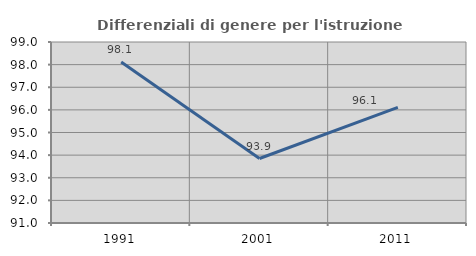
| Category | Differenziali di genere per l'istruzione superiore |
|---|---|
| 1991.0 | 98.116 |
| 2001.0 | 93.85 |
| 2011.0 | 96.115 |